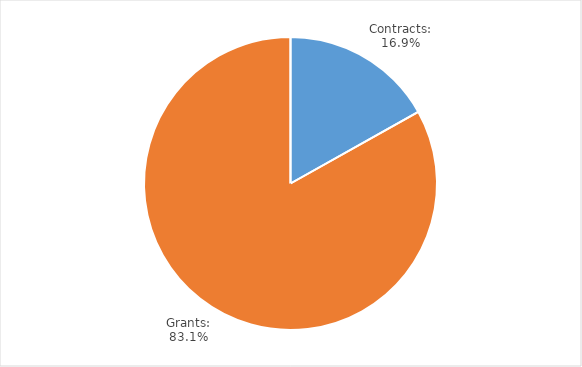
| Category | Percent |
|---|---|
| Contracts: | 0.169 |
| Grants: | 0.831 |